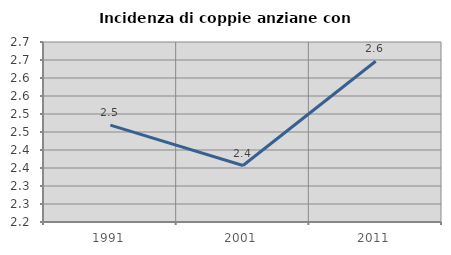
| Category | Incidenza di coppie anziane con figli |
|---|---|
| 1991.0 | 2.469 |
| 2001.0 | 2.357 |
| 2011.0 | 2.647 |